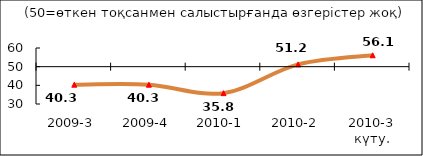
| Category | Series 5 |
|---|---|
| 2009-3 | 40.34 |
| 2009-4 | 40.345 |
| 2010-1 | 35.815 |
| 2010-2 | 51.195 |
| 2010-3 күту. | 56.1 |